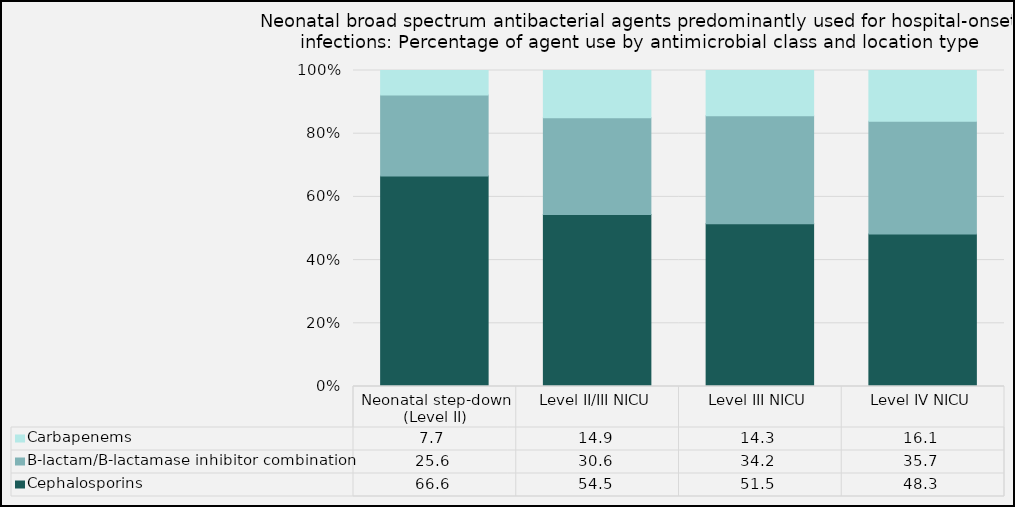
| Category | Cephalosporins | Β-lactam/Β-lactamase inhibitor combination | Carbapenems |
|---|---|---|---|
| Neonatal step-down (Level II) | 66.64 | 25.63 | 7.73 |
| Level II/III NICU | 54.46 | 30.61 | 14.93 |
| Level III NICU | 51.53 | 34.15 | 14.33 |
| Level IV NICU | 48.25 | 35.7 | 16.05 |